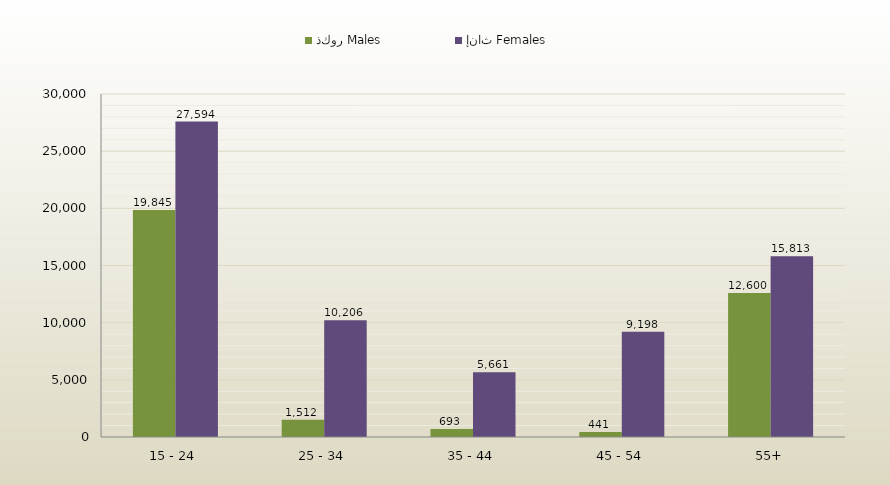
| Category | ذكور Males | إناث Females |
|---|---|---|
| 15 - 24 | 19845 | 27594 |
| 25 - 34 | 1512 | 10206 |
| 35 - 44 | 693 | 5661 |
| 45 - 54 | 441 | 9198 |
| 55+ | 12600 | 15813 |